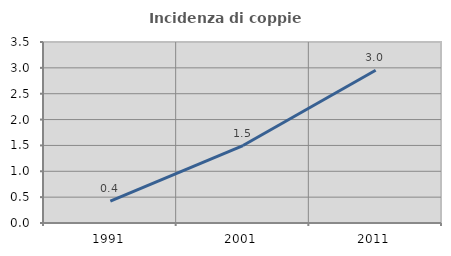
| Category | Incidenza di coppie miste |
|---|---|
| 1991.0 | 0.425 |
| 2001.0 | 1.498 |
| 2011.0 | 2.952 |